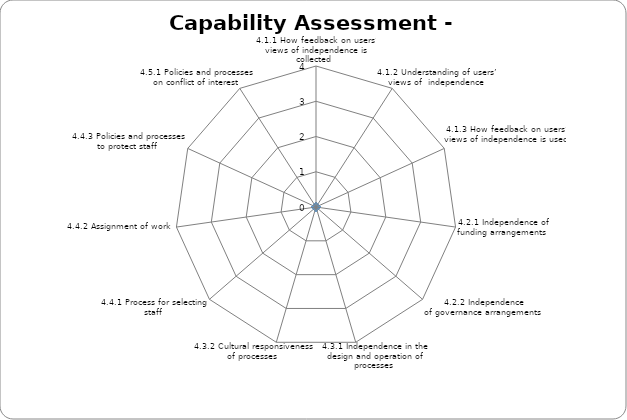
| Category | Series 0 |
|---|---|
| 4.1.1 How feedback on users’ views of independence is collected  | 0 |
| 4.1.2 Understanding of users’ views of  independence  | 0 |
| 4.1.3 How feedback on users’ views of independence is used  | 0 |
| 4.2.1 Independence of funding arrangements  | 0 |
| 4.2.2 Independence of governance arrangements  | 0 |
| 4.3.1 Independence in the design and operation of processes  | 0 |
| 4.3.2 Cultural responsiveness of processes  | 0 |
| 4.4.1 Process for selecting staff  | 0 |
| 4.4.2 Assignment of work  | 0 |
| 4.4.3 Policies and processes to protect staff  | 0 |
| 4.5.1 Policies and processes on conflict of interest  | 0 |